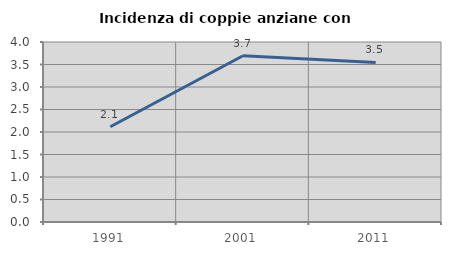
| Category | Incidenza di coppie anziane con figli |
|---|---|
| 1991.0 | 2.118 |
| 2001.0 | 3.695 |
| 2011.0 | 3.547 |